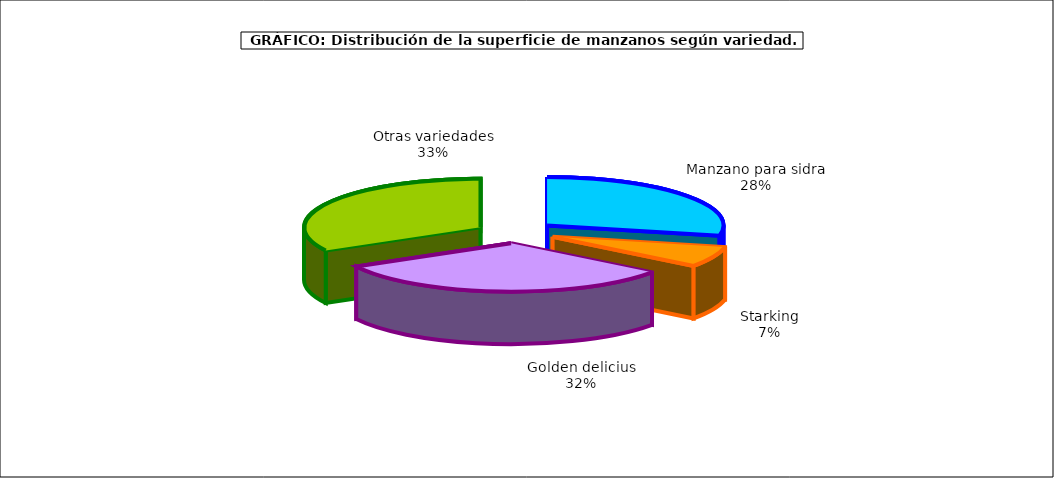
| Category | superficie |
|---|---|
| 0 | 8.372 |
| 1 | 2.028 |
| 2 | 9.364 |
| 3 | 9.726 |